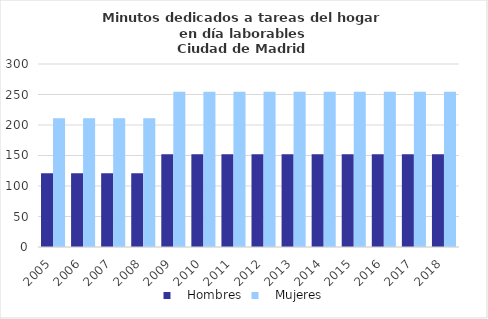
| Category |    Hombres |    Mujeres |
|---|---|---|
| 2005.0 | 121 | 211 |
| 2006.0 | 121 | 211 |
| 2007.0 | 121 | 211 |
| 2008.0 | 121 | 211 |
| 2009.0 | 152 | 254.539 |
| 2010.0 | 152 | 254.539 |
| 2011.0 | 152 | 254.539 |
| 2012.0 | 152 | 254.539 |
| 2013.0 | 152 | 254.539 |
| 2014.0 | 152 | 254.539 |
| 2015.0 | 152 | 254.539 |
| 2016.0 | 152 | 254.539 |
| 2017.0 | 152 | 254.539 |
| 2018.0 | 152 | 254.539 |